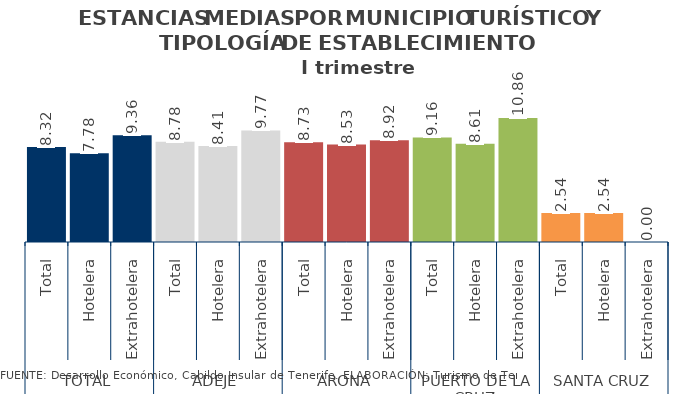
| Category | Series 2 |
|---|---|
| 0 | 8.316 |
| 1 | 7.778 |
| 2 | 9.361 |
| 3 | 8.784 |
| 4 | 8.405 |
| 5 | 9.772 |
| 6 | 8.731 |
| 7 | 8.533 |
| 8 | 8.922 |
| 9 | 9.156 |
| 10 | 8.615 |
| 11 | 10.856 |
| 12 | 2.539 |
| 13 | 2.539 |
| 14 | 0 |